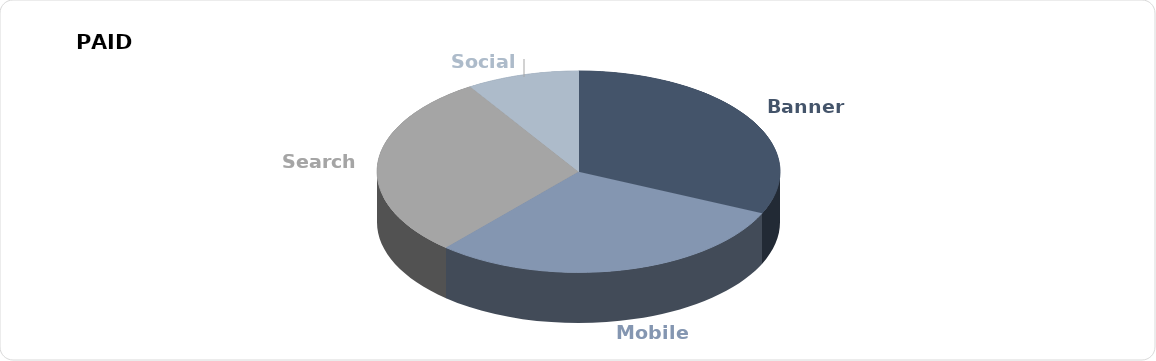
| Category | Series 1 | Series 0 |
|---|---|---|
| Banner Ads | 26346 | 26346 |
| Mobile Ads | 24571 | 24571 |
| Search (Pd) | 24490 | 24490 |
| Social (Pd) | 7493 | 7493 |